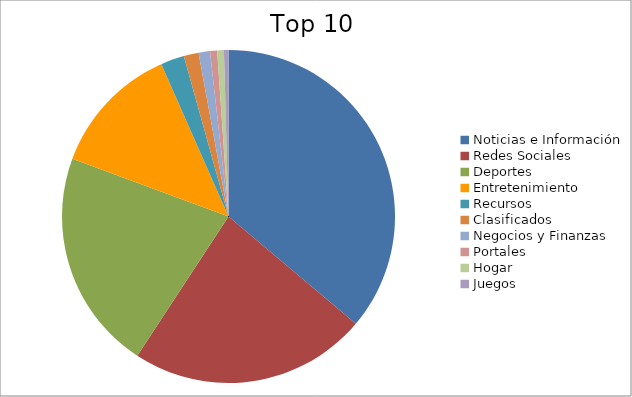
| Category | Series 0 |
|---|---|
| Noticias e Información | 35.61 |
| Redes Sociales | 22.74 |
| Deportes | 21.1 |
| Entretenimiento | 12.56 |
| Recursos | 2.25 |
| Clasificados | 1.42 |
| Negocios y Finanzas | 1.09 |
| Portales | 0.68 |
| Hogar | 0.64 |
| Juegos | 0.43 |